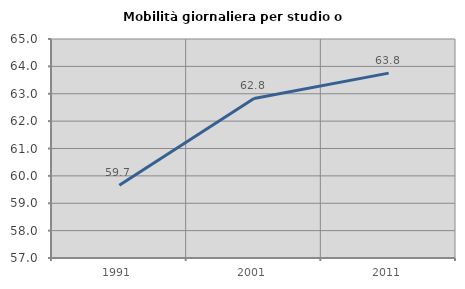
| Category | Mobilità giornaliera per studio o lavoro |
|---|---|
| 1991.0 | 59.657 |
| 2001.0 | 62.829 |
| 2011.0 | 63.754 |